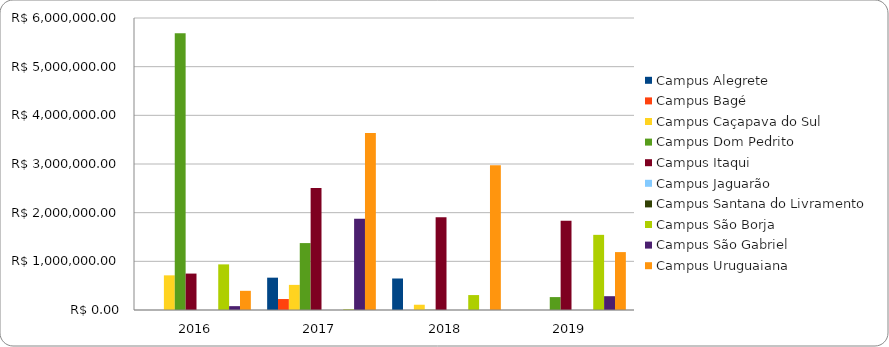
| Category | Campus Alegrete | Campus Bagé | Campus Caçapava do Sul | Campus Dom Pedrito | Campus Itaqui | Campus Jaguarão | Campus Santana do Livramento | Campus São Borja | Campus São Gabriel | Campus Uruguaiana |
|---|---|---|---|---|---|---|---|---|---|---|
| 2016.0 | 0 | 0 | 712100.84 | 5684426 | 748435.4 | 0 | 0 | 937388.84 | 79222.24 | 394032.79 |
| 2017.0 | 664393.25 | 225383.07 | 516046.96 | 1374956.51 | 2508019.47 | 0 | 0 | 13337.59 | 1875576.17 | 3635724.96 |
| 2018.0 | 647301.66 | 0 | 108215.05 | 4426.79 | 1903656.53 | 0 | 0 | 306830.6 | 0 | 2973941.79 |
| 2019.0 | 0 | 0 | 0 | 265274.51 | 1833151.21 | 0 | 0 | 1544177.21 | 283645.51 | 1189870.01 |